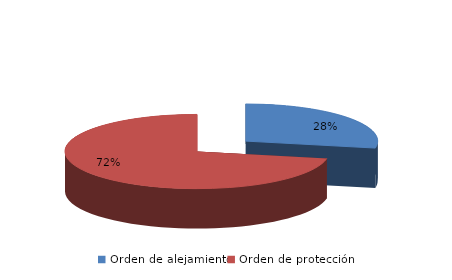
| Category | Series 0 |
|---|---|
| Orden de alejamiento | 440 |
| Orden de protección | 1131 |